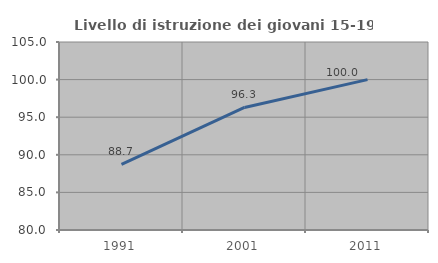
| Category | Livello di istruzione dei giovani 15-19 anni |
|---|---|
| 1991.0 | 88.732 |
| 2001.0 | 96.296 |
| 2011.0 | 100 |